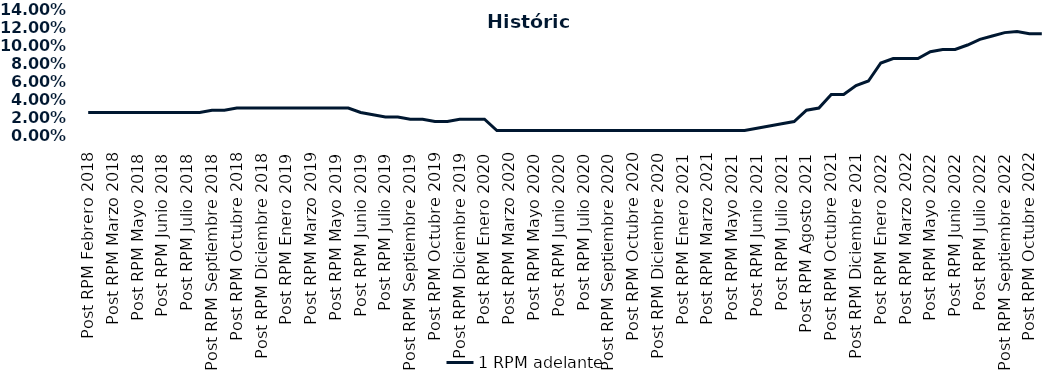
| Category | 1 RPM adelante |
|---|---|
| Post RPM Febrero 2018 | 0.025 |
| Pre RPM Marzo 2018 | 0.025 |
| Post RPM Marzo 2018 | 0.025 |
| Pre RPM Mayo 2018 | 0.025 |
| Post RPM Mayo 2018 | 0.025 |
| Pre RPM Junio 2018 | 0.025 |
| Post RPM Junio 2018 | 0.025 |
| Pre RPM Julio 2018 | 0.025 |
| Post RPM Julio 2018 | 0.025 |
| Pre RPM Septiembre 2018 | 0.025 |
| Post RPM Septiembre 2018 | 0.028 |
| Pre RPM Octubre 2018 | 0.028 |
| Post RPM Octubre 2018 | 0.03 |
| Pre RPM Diciembre 2018 | 0.03 |
| Post RPM Diciembre 2018 | 0.03 |
| Pre RPM Enero 2019 | 0.03 |
| Post RPM Enero 2019 | 0.03 |
| Pre RPM Marzo 2019 | 0.03 |
| Post RPM Marzo 2019 | 0.03 |
| Pre RPM Mayo 2019 | 0.03 |
| Post RPM Mayo 2019 | 0.03 |
| Pre RPM Junio 2019 | 0.03 |
| Post RPM Junio 2019 | 0.025 |
| Pre RPM Julio 2019 | 0.022 |
| Post RPM Julio 2019 | 0.02 |
| Pre RPM Septiembre 2019 | 0.02 |
| Post RPM Septiembre 2019 | 0.018 |
| Pre RPM Octubre 2019 | 0.018 |
| Post RPM Octubre 2019 | 0.015 |
| Pre RPM Diciembre 2019 | 0.015 |
| Post RPM Diciembre 2019 | 0.018 |
| Pre RPM Enero 2020 | 0.018 |
| Post RPM Enero 2020 | 0.018 |
| Pre RPM Marzo 2020 | 0.005 |
| Post RPM Marzo 2020 | 0.005 |
| Pre RPM Mayo 2020 | 0.005 |
| Post RPM Mayo 2020 | 0.005 |
| Pre RPM Junio 2020 | 0.005 |
| Post RPM Junio 2020 | 0.005 |
| Pre RPM Julio 2020 | 0.005 |
| Post RPM Julio 2020 | 0.005 |
| Pre RPM Septiembre 2020 | 0.005 |
| Post RPM Septiembre 2020 | 0.005 |
| Pre RPM Octubre 2020 | 0.005 |
| Post RPM Octubre 2020 | 0.005 |
| Pre RPM Diciembre 2020 | 0.005 |
| Post RPM Diciembre 2020 | 0.005 |
| Pre RPM Enero 2021 | 0.005 |
| Post RPM Enero 2021 | 0.005 |
| Pre RPM Marzo 2021 | 0.005 |
| Post RPM Marzo 2021 | 0.005 |
| Pre RPM Mayo 2021 | 0.005 |
| Post RPM Mayo 2021 | 0.005 |
| Pre RPM Junio 2021 | 0.005 |
| Post RPM Junio 2021 | 0.008 |
| Pre RPM Julio 2021 | 0.01 |
| Post RPM Julio 2021 | 0.012 |
| Pre RPM Agosto 2021 | 0.015 |
| Post RPM Agosto 2021 | 0.028 |
| Pre RPM Octubre 2021 | 0.03 |
| Post RPM Octubre 2021 | 0.045 |
| Pre RPM Diciembre 2021 | 0.045 |
| Post RPM Diciembre 2021 | 0.055 |
| Pre RPM Enero 2022 | 0.06 |
| Post RPM Enero 2022 | 0.08 |
| Pre RPM Marzo 2022 | 0.085 |
| Post RPM Marzo 2022 | 0.085 |
| Pre RPM Mayo 2022 | 0.085 |
| Post RPM Mayo 2022 | 0.092 |
| Pre RPM Junio 2022 | 0.095 |
| Post RPM Junio 2022 | 0.095 |
| Pre RPM Julio 2022 | 0.1 |
| Post RPM Julio 2022 | 0.106 |
| Pre RPM Septiembre 2022 | 0.11 |
| Post RPM Septiembre 2022 | 0.114 |
| Pre RPM Octubre 2022 | 0.115 |
| Post RPM Octubre 2022 | 0.112 |
| Pre RPM Diciembre 2022 | 0.112 |